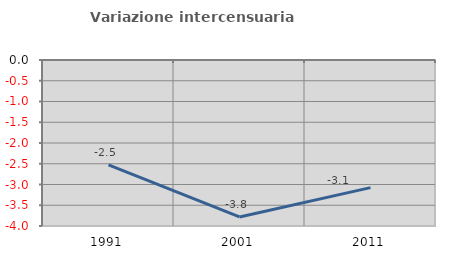
| Category | Variazione intercensuaria annua |
|---|---|
| 1991.0 | -2.525 |
| 2001.0 | -3.782 |
| 2011.0 | -3.075 |